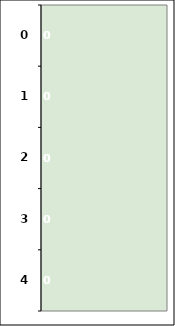
| Category | Series 0 |
|---|---|
| 0.0 | 0 |
| 1.0 | 0 |
| 2.0 | 0 |
| 3.0 | 0 |
| 4.0 | 0 |